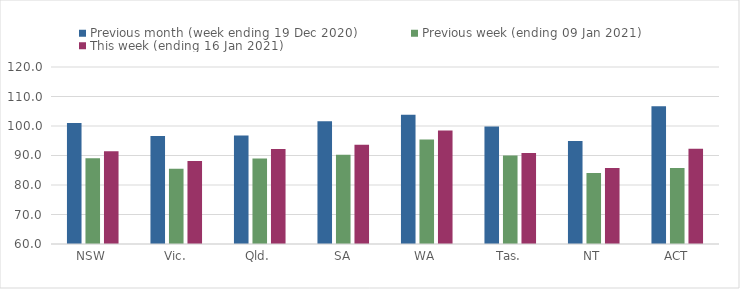
| Category | Previous month (week ending 19 Dec 2020) | Previous week (ending 09 Jan 2021) | This week (ending 16 Jan 2021) |
|---|---|---|---|
| NSW | 101.02 | 89.06 | 91.42 |
| Vic. | 96.58 | 85.55 | 88.11 |
| Qld. | 96.75 | 88.97 | 92.2 |
| SA | 101.59 | 90.26 | 93.61 |
| WA | 103.82 | 95.46 | 98.47 |
| Tas. | 99.81 | 89.98 | 90.83 |
| NT | 94.9 | 84.09 | 85.78 |
| ACT | 106.69 | 85.73 | 92.25 |